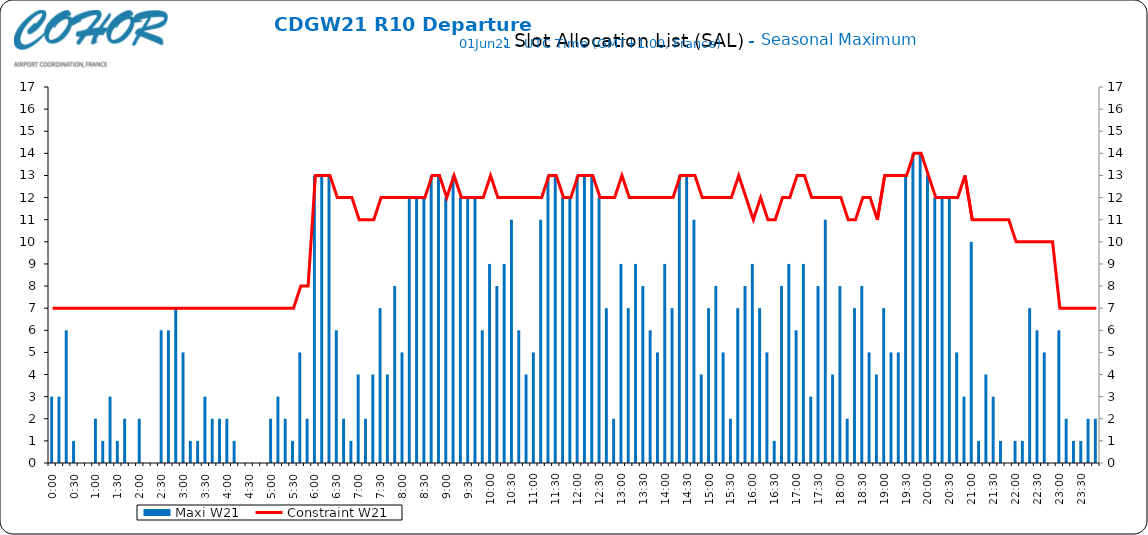
| Category | Maxi W21 |
|---|---|
| 0.0 | 3 |
| 0.006944444444444444 | 3 |
| 0.013888888888888888 | 6 |
| 0.020833333333333332 | 1 |
| 0.027777777777777776 | 0 |
| 0.034722222222222224 | 0 |
| 0.041666666666666664 | 2 |
| 0.04861111111111111 | 1 |
| 0.05555555555555555 | 3 |
| 0.0625 | 1 |
| 0.06944444444444443 | 2 |
| 0.0763888888888889 | 0 |
| 0.08333333333333333 | 2 |
| 0.09027777777777778 | 0 |
| 0.09722222222222222 | 0 |
| 0.10416666666666667 | 6 |
| 0.1111111111111111 | 6 |
| 0.11805555555555557 | 7 |
| 0.125 | 5 |
| 0.13194444444444445 | 1 |
| 0.1388888888888889 | 1 |
| 0.14583333333333334 | 3 |
| 0.15277777777777776 | 2 |
| 0.15972222222222224 | 2 |
| 0.16666666666666666 | 2 |
| 0.17361111111111113 | 1 |
| 0.18055555555555555 | 0 |
| 0.1875 | 0 |
| 0.19444444444444445 | 0 |
| 0.20138888888888887 | 0 |
| 0.20833333333333334 | 2 |
| 0.2152777777777778 | 3 |
| 0.2222222222222222 | 2 |
| 0.22916666666666666 | 1 |
| 0.23611111111111113 | 5 |
| 0.24305555555555555 | 2 |
| 0.25 | 13 |
| 0.2569444444444445 | 13 |
| 0.2638888888888889 | 13 |
| 0.2708333333333333 | 6 |
| 0.2777777777777778 | 2 |
| 0.2847222222222222 | 1 |
| 0.2916666666666667 | 4 |
| 0.2986111111111111 | 2 |
| 0.3055555555555555 | 4 |
| 0.3125 | 7 |
| 0.3194444444444445 | 4 |
| 0.3263888888888889 | 8 |
| 0.3333333333333333 | 5 |
| 0.34027777777777773 | 12 |
| 0.34722222222222227 | 12 |
| 0.3541666666666667 | 12 |
| 0.3611111111111111 | 13 |
| 0.3680555555555556 | 13 |
| 0.375 | 12 |
| 0.3819444444444444 | 13 |
| 0.3888888888888889 | 12 |
| 0.3958333333333333 | 12 |
| 0.40277777777777773 | 12 |
| 0.40972222222222227 | 6 |
| 0.4166666666666667 | 9 |
| 0.4236111111111111 | 8 |
| 0.4305555555555556 | 9 |
| 0.4375 | 11 |
| 0.4444444444444444 | 6 |
| 0.4513888888888889 | 4 |
| 0.4583333333333333 | 5 |
| 0.46527777777777773 | 11 |
| 0.47222222222222227 | 13 |
| 0.4791666666666667 | 13 |
| 0.4861111111111111 | 12 |
| 0.4930555555555556 | 12 |
| 0.5 | 13 |
| 0.5069444444444444 | 13 |
| 0.513888888888889 | 13 |
| 0.5208333333333334 | 12 |
| 0.5277777777777778 | 7 |
| 0.5347222222222222 | 2 |
| 0.5416666666666666 | 9 |
| 0.548611111111111 | 7 |
| 0.5555555555555556 | 9 |
| 0.5625 | 8 |
| 0.5694444444444444 | 6 |
| 0.576388888888889 | 5 |
| 0.5833333333333334 | 9 |
| 0.5902777777777778 | 7 |
| 0.5972222222222222 | 13 |
| 0.6041666666666666 | 13 |
| 0.611111111111111 | 11 |
| 0.6180555555555556 | 4 |
| 0.625 | 7 |
| 0.6319444444444444 | 8 |
| 0.638888888888889 | 5 |
| 0.6458333333333334 | 2 |
| 0.6527777777777778 | 7 |
| 0.6597222222222222 | 8 |
| 0.6666666666666666 | 9 |
| 0.6736111111111112 | 7 |
| 0.6805555555555555 | 5 |
| 0.6875 | 1 |
| 0.6944444444444445 | 8 |
| 0.7013888888888888 | 9 |
| 0.7083333333333334 | 6 |
| 0.7152777777777778 | 9 |
| 0.7222222222222222 | 3 |
| 0.7291666666666666 | 8 |
| 0.7361111111111112 | 11 |
| 0.7430555555555555 | 4 |
| 0.75 | 8 |
| 0.7569444444444445 | 2 |
| 0.7638888888888888 | 7 |
| 0.7708333333333334 | 8 |
| 0.7777777777777778 | 5 |
| 0.7847222222222222 | 4 |
| 0.7916666666666666 | 7 |
| 0.7986111111111112 | 5 |
| 0.8055555555555555 | 5 |
| 0.8125 | 13 |
| 0.8194444444444445 | 14 |
| 0.8263888888888888 | 14 |
| 0.8333333333333334 | 13 |
| 0.8402777777777778 | 12 |
| 0.8472222222222222 | 12 |
| 0.8541666666666666 | 12 |
| 0.8611111111111112 | 5 |
| 0.8680555555555555 | 3 |
| 0.875 | 10 |
| 0.8819444444444445 | 1 |
| 0.8888888888888888 | 4 |
| 0.8958333333333334 | 3 |
| 0.9027777777777778 | 1 |
| 0.9097222222222222 | 0 |
| 0.9166666666666666 | 1 |
| 0.9236111111111112 | 1 |
| 0.9305555555555555 | 7 |
| 0.9375 | 6 |
| 0.9444444444444445 | 5 |
| 0.9513888888888888 | 0 |
| 0.9583333333333334 | 6 |
| 0.9652777777777778 | 2 |
| 0.9722222222222222 | 1 |
| 0.9791666666666666 | 1 |
| 0.9861111111111112 | 2 |
| 0.9930555555555555 | 2 |